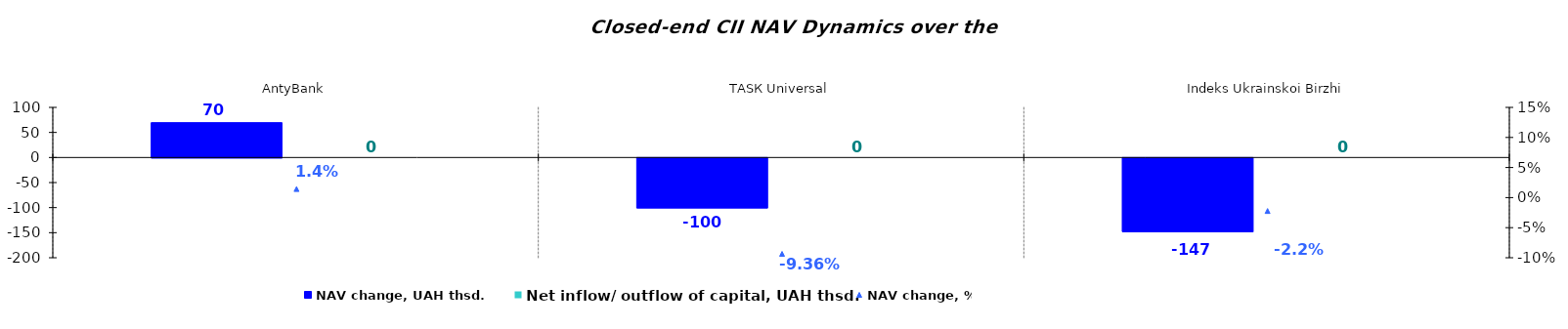
| Category | NAV change, UAH thsd. | Net inflow/ outflow of capital, UAH thsd. |
|---|---|---|
| AntyBank | 69.552 | 0 |
| ТАSК Universal | -99.625 | 0 |
| Indeks Ukrainskoi Birzhi | -147.019 | 0 |